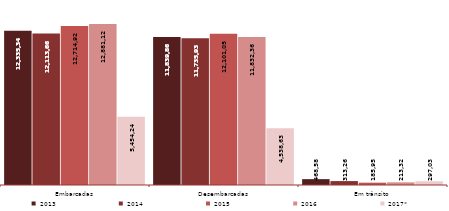
| Category | 2013 | 2014 | 2015 | 2016 | 2017* |
|---|---|---|---|---|---|
| Embarcadas | 12335344 | 12113666 | 12714920 | 12881124 | 5454242 |
| Desembarcadas | 11839867 | 11735931 | 12101057 | 11832368 | 4538634 |
| Em trânsito | 468588 | 313269 | 185952 | 213321 | 297035 |